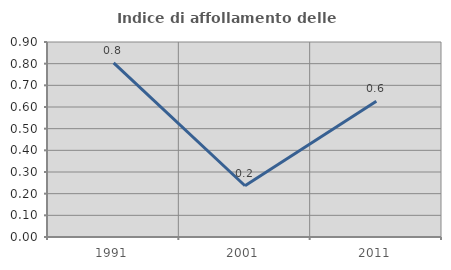
| Category | Indice di affollamento delle abitazioni  |
|---|---|
| 1991.0 | 0.804 |
| 2001.0 | 0.237 |
| 2011.0 | 0.626 |